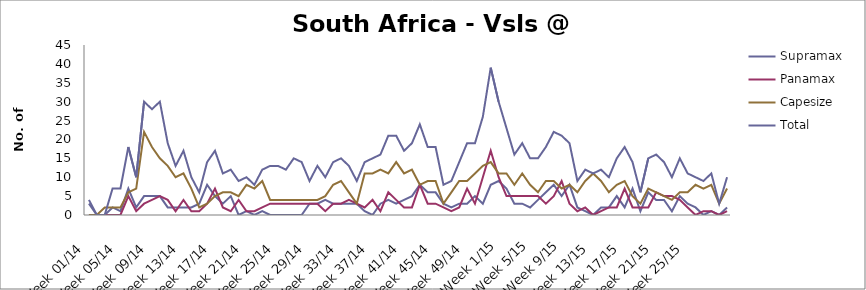
| Category | Supramax | Panamax | Capesize | Total |
|---|---|---|---|---|
| Week 01/14 | 3 | 0 | 0 | 4 |
| Week 02/14 | 0 | 0 | 0 | 0 |
| Week 03/14 | 0 | 0 | 2 | 0 |
| Week 04/14 | 2 | 0 | 2 | 7 |
| Week 05/14 | 1 | 0 | 2 | 7 |
| Week 06/14 | 7 | 5 | 6 | 18 |
| Week 07/14 | 2 | 1 | 7 | 10 |
| Week 08/14 | 5 | 3 | 22 | 30 |
| Week 09/14 | 5 | 4 | 18 | 28 |
| Week 10/14 | 5 | 5 | 15 | 30 |
| Week 11/14 | 2 | 4 | 13 | 19 |
| Week 12/14 | 2 | 1 | 10 | 13 |
| Week 13/14 | 2 | 4 | 11 | 17 |
| Week 14/14 | 2 | 1 | 7 | 10 |
| Week 15/14 | 3 | 1 | 2 | 6 |
| Week 16/14 | 8 | 3 | 3 | 14 |
| Week 17/14 | 5 | 7 | 5 | 17 |
| Week 18/14 | 3 | 2 | 6 | 11 |
| Week 19/14 | 5 | 1 | 6 | 12 |
| Week 20/14 | 0 | 4 | 5 | 9 |
| Week 21/14 | 1 | 1 | 8 | 10 |
| Week 22/14 | 0 | 1 | 7 | 8 |
| Week 23/14 | 1 | 2 | 9 | 12 |
| Week 24/14 | 0 | 3 | 4 | 13 |
| Week 25/14 | 0 | 3 | 4 | 13 |
| Week 26/14 | 0 | 3 | 4 | 12 |
| Week 27/14 | 0 | 3 | 4 | 15 |
| Week 28/14 | 0 | 3 | 4 | 14 |
| Week 29/14 | 3 | 3 | 4 | 9 |
| Week 30/14 | 3 | 3 | 4 | 13 |
| Week 31/14 | 4 | 1 | 5 | 10 |
| Week 32/14 | 3 | 3 | 8 | 14 |
| Week 33/14 | 3 | 3 | 9 | 15 |
| Week 34/14 | 3 | 4 | 6 | 13 |
| Week 35/14 | 3 | 3 | 3 | 9 |
| Week 36/14 | 1 | 2 | 11 | 14 |
| Week 37/14 | 0 | 4 | 11 | 15 |
| Week 38/14 | 3 | 1 | 12 | 16 |
| Week 39/14 | 4 | 6 | 11 | 21 |
| Week 40/14 | 3 | 4 | 14 | 21 |
| Week 41/14 | 4 | 2 | 11 | 17 |
| Week 42/14 | 5 | 2 | 12 | 19 |
| Week 43/14 | 8 | 8 | 8 | 24 |
| Week 44/14 | 6 | 3 | 9 | 18 |
| Week 45/14 | 6 | 3 | 9 | 18 |
| Week 46/14 | 3 | 2 | 3 | 8 |
| Week 47/14 | 2 | 1 | 6 | 9 |
| Week 48/14 | 3 | 2 | 9 | 14 |
| Week 49/14 | 3 | 7 | 9 | 19 |
| Week 50/14 | 5 | 3 | 11 | 19 |
| Week 51/14 | 3 | 10 | 13 | 26 |
| Week 52/14 | 8 | 17 | 14 | 39 |
| Week 1/15 | 9 | 10 | 11 | 30 |
| Week 2/15 | 7 | 5 | 11 | 23 |
| Week 3/15 | 3 | 5 | 8 | 16 |
| Week 4/15 | 3 | 5 | 11 | 19 |
| Week 5/15 | 2 | 5 | 8 | 15 |
| Week 6/15 | 4 | 5 | 6 | 15 |
| Week 7/15 | 6 | 3 | 9 | 18 |
| Week 8/15 | 8 | 5 | 9 | 22 |
| Week 9/15 | 5 | 9 | 7 | 21 |
| Week 10/15 | 8 | 3 | 8 | 19 |
| Week 11/15 | 2 | 1 | 6 | 9 |
| Week 12/15 | 1 | 2 | 9 | 12 |
| Week 13/15 | 0 | 0 | 11 | 11 |
| Week 14/15 | 2 | 1 | 9 | 12 |
| Week 15/15 | 2 | 2 | 6 | 10 |
| Week 16/15 | 5 | 2 | 8 | 15 |
| Week 17/15 | 2 | 7 | 9 | 18 |
| Week 18/15 | 7 | 2 | 5 | 14 |
| Week 19/15 | 1 | 2 | 3 | 6 |
| Week 20/15 | 6 | 2 | 7 | 15 |
| Week 21/15 | 4 | 6 | 6 | 16 |
| Week 22/15 | 4 | 5 | 5 | 14 |
| Week 23/15 | 1 | 5 | 4 | 10 |
| Week 24/15 | 5 | 4 | 6 | 15 |
| Week 25/15 | 3 | 2 | 6 | 11 |